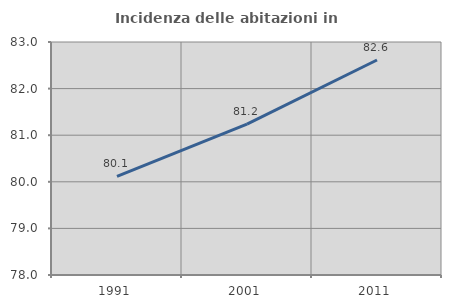
| Category | Incidenza delle abitazioni in proprietà  |
|---|---|
| 1991.0 | 80.117 |
| 2001.0 | 81.239 |
| 2011.0 | 82.613 |